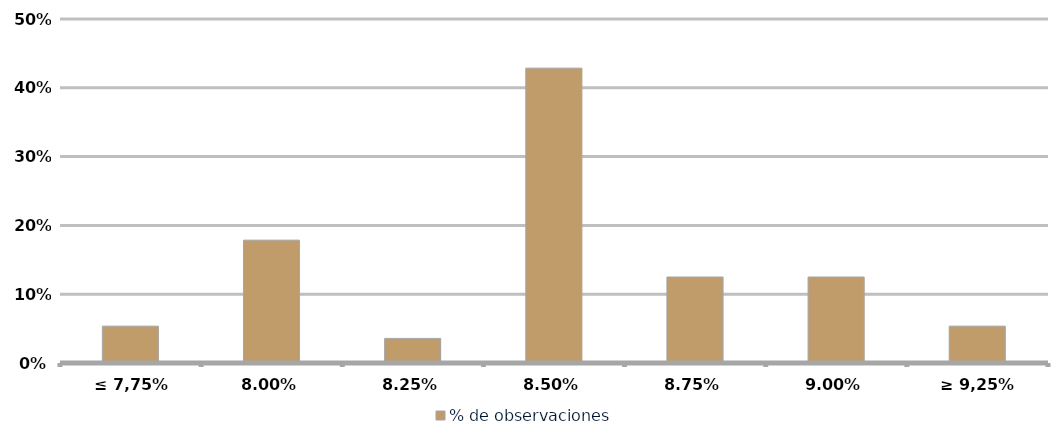
| Category | % de observaciones  |
|---|---|
| ≤ 7,75% | 0.054 |
| 8,00% | 0.179 |
| 8,25% | 0.036 |
| 8,50% | 0.429 |
| 8,75% | 0.125 |
| 9,00% | 0.125 |
| ≥ 9,25% | 0.054 |